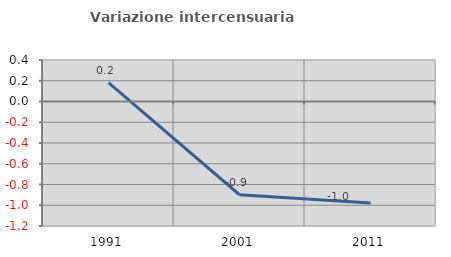
| Category | Variazione intercensuaria annua |
|---|---|
| 1991.0 | 0.181 |
| 2001.0 | -0.899 |
| 2011.0 | -0.979 |